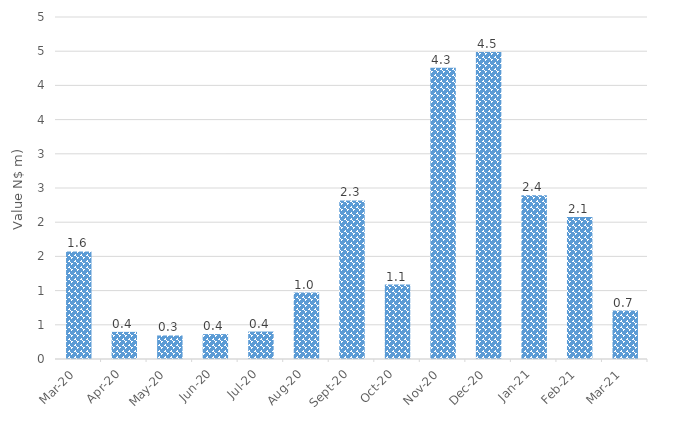
| Category | Value (N$ m) |
|---|---|
| 2020-03-01 | 1.572 |
| 2020-04-01 | 0.397 |
| 2020-05-01 | 0.344 |
| 2020-06-01 | 0.364 |
| 2020-07-01 | 0.401 |
| 2020-08-01 | 0.972 |
| 2020-09-01 | 2.318 |
| 2020-10-01 | 1.088 |
| 2020-11-01 | 4.258 |
| 2020-12-01 | 4.487 |
| 2021-01-01 | 2.396 |
| 2021-02-01 | 2.075 |
| 2021-03-01 | 0.708 |